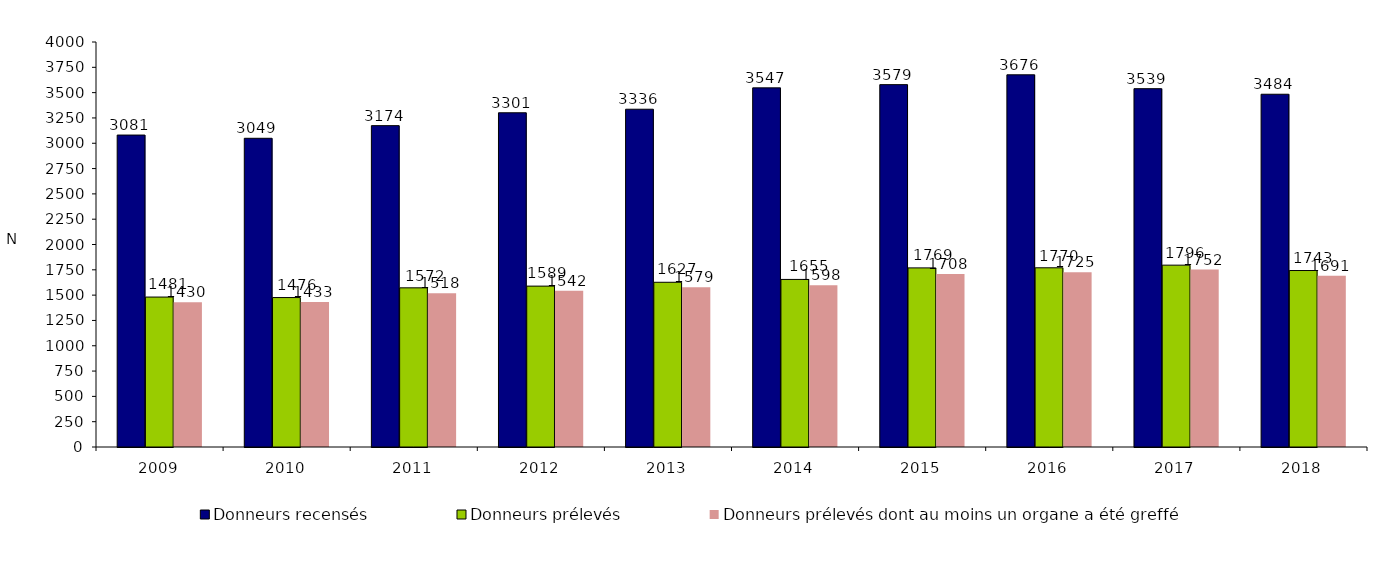
| Category | Donneurs recensés | Donneurs prélevés | Donneurs prélevés dont au moins un organe a été greffé |
|---|---|---|---|
| 2009.0 | 3081 | 1481 | 1430 |
| 2010.0 | 3049 | 1476 | 1433 |
| 2011.0 | 3174 | 1572 | 1518 |
| 2012.0 | 3301 | 1589 | 1542 |
| 2013.0 | 3336 | 1627 | 1579 |
| 2014.0 | 3547 | 1655 | 1598 |
| 2015.0 | 3579 | 1769 | 1708 |
| 2016.0 | 3676 | 1770 | 1725 |
| 2017.0 | 3539 | 1796 | 1752 |
| 2018.0 | 3484 | 1743 | 1691 |